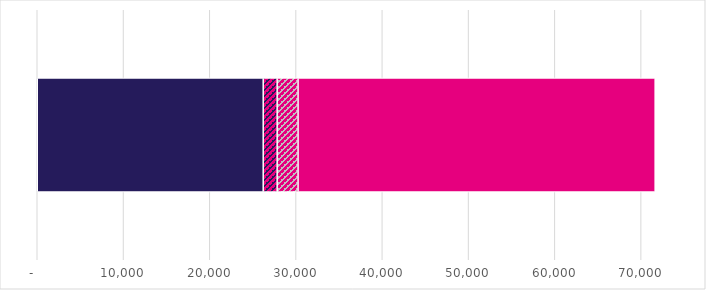
| Category | P&B only | Multiple - including P&B | Multiple - ELP and SAP | ELP only, SAP only and Unknown |
|---|---|---|---|---|
| 0 | 26195 | 1620 | 2420 | 41395 |